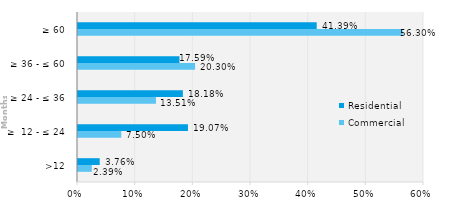
| Category | Commercial | Residential |
|---|---|---|
| >12 | 0.024 | 0.038 |
| ≥  12 - ≤ 24 | 0.075 | 0.191 |
| ≥ 24 - ≤ 36 | 0.135 | 0.182 |
| ≥ 36 - ≤ 60 | 0.203 | 0.176 |
| ≥ 60 | 0.563 | 0.414 |